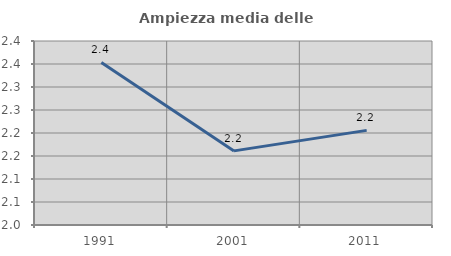
| Category | Ampiezza media delle famiglie |
|---|---|
| 1991.0 | 2.353 |
| 2001.0 | 2.161 |
| 2011.0 | 2.206 |